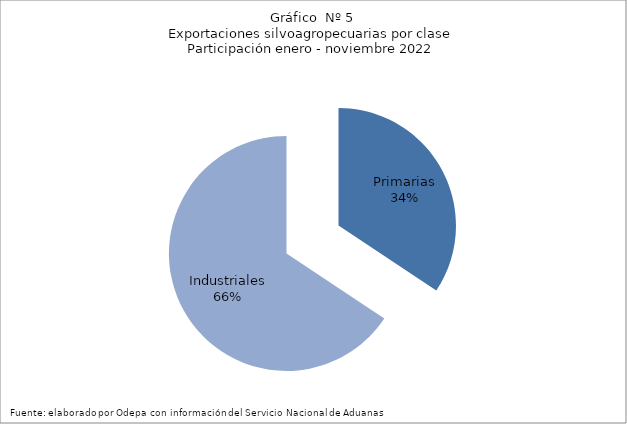
| Category | Series 0 |
|---|---|
| Primarias | 5820454 |
| Industriales | 11125285 |